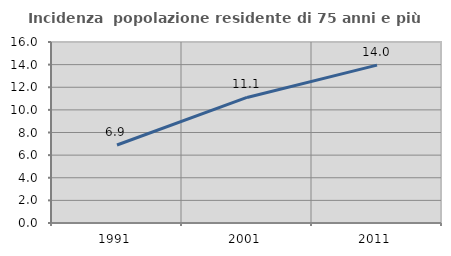
| Category | Incidenza  popolazione residente di 75 anni e più |
|---|---|
| 1991.0 | 6.893 |
| 2001.0 | 11.099 |
| 2011.0 | 13.956 |